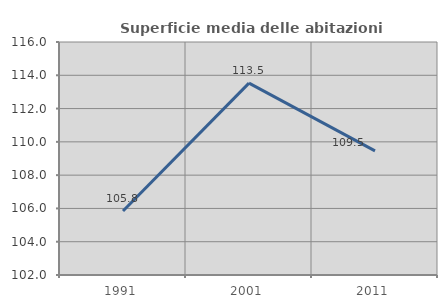
| Category | Superficie media delle abitazioni occupate |
|---|---|
| 1991.0 | 105.845 |
| 2001.0 | 113.53 |
| 2011.0 | 109.456 |